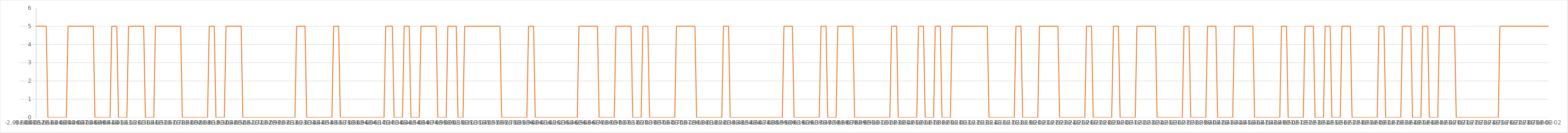
| Category | Series 1 |
|---|---|
| 0.0 | 5 |
| 2e-05 | 5 |
| 4e-05 | 5 |
| 6.000000000000001e-05 | 5 |
| 8e-05 | 5 |
| 0.0001 | 5 |
| 0.00012 | 5 |
| 0.00014000000000000001 | 0 |
| 0.00016 | 0 |
| 0.00018 | 0 |
| 0.0002 | 0 |
| 0.00022 | 0 |
| 0.00024 | 0 |
| 0.00026000000000000003 | 0 |
| 0.00028000000000000003 | 0 |
| 0.00030000000000000003 | 0 |
| 0.00032 | 0 |
| 0.00034 | 0 |
| 0.00036 | 0 |
| 0.00038 | 5 |
| 0.0004 | 5 |
| 0.00042 | 5 |
| 0.00044 | 5 |
| 0.00046 | 5 |
| 0.00048 | 5 |
| 0.0005 | 5 |
| 0.0005200000000000001 | 5 |
| 0.0005400000000000001 | 5 |
| 0.0005600000000000002 | 5 |
| 0.0005800000000000002 | 5 |
| 0.0006000000000000003 | 5 |
| 0.0006200000000000003 | 5 |
| 0.0006400000000000004 | 5 |
| 0.0006600000000000004 | 5 |
| 0.0006800000000000005 | 5 |
| 0.0007000000000000005 | 0 |
| 0.0007200000000000006 | 0 |
| 0.0007400000000000006 | 0 |
| 0.0007600000000000007 | 0 |
| 0.0007800000000000007 | 0 |
| 0.0008000000000000008 | 0 |
| 0.0008200000000000008 | 0 |
| 0.0008400000000000009 | 0 |
| 0.000860000000000001 | 0 |
| 0.000880000000000001 | 0 |
| 0.0009000000000000011 | 5 |
| 0.0009200000000000011 | 5 |
| 0.0009400000000000012 | 5 |
| 0.0009600000000000012 | 5 |
| 0.0009800000000000013 | 0 |
| 0.0010000000000000013 | 0 |
| 0.0010200000000000014 | 0 |
| 0.0010400000000000014 | 0 |
| 0.0010600000000000015 | 0 |
| 0.0010800000000000015 | 0 |
| 0.0011000000000000016 | 5 |
| 0.0011200000000000016 | 5 |
| 0.0011400000000000017 | 5 |
| 0.0011600000000000017 | 5 |
| 0.0011800000000000018 | 5 |
| 0.0012000000000000018 | 5 |
| 0.001220000000000002 | 5 |
| 0.001240000000000002 | 5 |
| 0.001260000000000002 | 5 |
| 0.001280000000000002 | 5 |
| 0.0013000000000000021 | 0 |
| 0.0013200000000000022 | 0 |
| 0.0013400000000000022 | 0 |
| 0.0013600000000000023 | 0 |
| 0.0013800000000000023 | 0 |
| 0.0014000000000000024 | 0 |
| 0.0014200000000000024 | 5 |
| 0.0014400000000000025 | 5 |
| 0.0014600000000000025 | 5 |
| 0.0014800000000000026 | 5 |
| 0.0015000000000000026 | 5 |
| 0.0015200000000000027 | 5 |
| 0.0015400000000000027 | 5 |
| 0.0015600000000000028 | 5 |
| 0.0015800000000000028 | 5 |
| 0.001600000000000003 | 5 |
| 0.001620000000000003 | 5 |
| 0.001640000000000003 | 5 |
| 0.001660000000000003 | 5 |
| 0.001680000000000003 | 5 |
| 0.0017000000000000032 | 5 |
| 0.0017200000000000032 | 5 |
| 0.0017400000000000033 | 0 |
| 0.0017600000000000033 | 0 |
| 0.0017800000000000034 | 0 |
| 0.0018000000000000034 | 0 |
| 0.0018200000000000035 | 0 |
| 0.0018400000000000035 | 0 |
| 0.0018600000000000036 | 0 |
| 0.0018800000000000036 | 0 |
| 0.0019000000000000037 | 0 |
| 0.0019200000000000037 | 0 |
| 0.0019400000000000038 | 0 |
| 0.001960000000000004 | 0 |
| 0.001980000000000004 | 0 |
| 0.002000000000000004 | 0 |
| 0.002020000000000004 | 0 |
| 0.002040000000000004 | 0 |
| 0.002060000000000004 | 5 |
| 0.002080000000000004 | 5 |
| 0.002100000000000004 | 5 |
| 0.0021200000000000043 | 5 |
| 0.0021400000000000043 | 0 |
| 0.0021600000000000044 | 0 |
| 0.0021800000000000044 | 0 |
| 0.0022000000000000045 | 0 |
| 0.0022200000000000045 | 0 |
| 0.0022400000000000046 | 0 |
| 0.0022600000000000046 | 5 |
| 0.0022800000000000047 | 5 |
| 0.0023000000000000047 | 5 |
| 0.002320000000000005 | 5 |
| 0.002340000000000005 | 5 |
| 0.002360000000000005 | 5 |
| 0.002380000000000005 | 5 |
| 0.002400000000000005 | 5 |
| 0.002420000000000005 | 5 |
| 0.002440000000000005 | 5 |
| 0.002460000000000005 | 0 |
| 0.002480000000000005 | 0 |
| 0.0025000000000000053 | 0 |
| 0.0025200000000000053 | 0 |
| 0.0025400000000000054 | 0 |
| 0.0025600000000000054 | 0 |
| 0.0025800000000000055 | 0 |
| 0.0026000000000000055 | 0 |
| 0.0026200000000000056 | 0 |
| 0.0026400000000000056 | 0 |
| 0.0026600000000000057 | 0 |
| 0.0026800000000000057 | 0 |
| 0.0027000000000000058 | 0 |
| 0.002720000000000006 | 0 |
| 0.002740000000000006 | 0 |
| 0.002760000000000006 | 0 |
| 0.002780000000000006 | 0 |
| 0.002800000000000006 | 0 |
| 0.002820000000000006 | 0 |
| 0.002840000000000006 | 0 |
| 0.002860000000000006 | 0 |
| 0.0028800000000000063 | 0 |
| 0.0029000000000000063 | 0 |
| 0.0029200000000000064 | 0 |
| 0.0029400000000000064 | 0 |
| 0.0029600000000000065 | 0 |
| 0.0029800000000000065 | 0 |
| 0.0030000000000000066 | 0 |
| 0.0030200000000000066 | 0 |
| 0.0030400000000000067 | 0 |
| 0.0030600000000000067 | 0 |
| 0.0030800000000000068 | 0 |
| 0.003100000000000007 | 5 |
| 0.003120000000000007 | 5 |
| 0.003140000000000007 | 5 |
| 0.003160000000000007 | 5 |
| 0.003180000000000007 | 5 |
| 0.003200000000000007 | 5 |
| 0.003220000000000007 | 0 |
| 0.003240000000000007 | 0 |
| 0.0032600000000000072 | 0 |
| 0.0032800000000000073 | 0 |
| 0.0033000000000000074 | 0 |
| 0.0033200000000000074 | 0 |
| 0.0033400000000000075 | 0 |
| 0.0033600000000000075 | 0 |
| 0.0033800000000000076 | 0 |
| 0.0034000000000000076 | 0 |
| 0.0034200000000000077 | 0 |
| 0.0034400000000000077 | 0 |
| 0.0034600000000000078 | 0 |
| 0.003480000000000008 | 0 |
| 0.003500000000000008 | 0 |
| 0.003520000000000008 | 0 |
| 0.003540000000000008 | 5 |
| 0.003560000000000008 | 5 |
| 0.003580000000000008 | 5 |
| 0.003600000000000008 | 5 |
| 0.003620000000000008 | 0 |
| 0.0036400000000000082 | 0 |
| 0.0036600000000000083 | 0 |
| 0.0036800000000000084 | 0 |
| 0.0037000000000000084 | 0 |
| 0.0037200000000000085 | 0 |
| 0.0037400000000000085 | 0 |
| 0.0037600000000000086 | 0 |
| 0.0037800000000000086 | 0 |
| 0.0038000000000000087 | 0 |
| 0.0038200000000000087 | 0 |
| 0.0038400000000000088 | 0 |
| 0.003860000000000009 | 0 |
| 0.003880000000000009 | 0 |
| 0.003900000000000009 | 0 |
| 0.0039200000000000085 | 0 |
| 0.003940000000000009 | 0 |
| 0.003960000000000009 | 0 |
| 0.003980000000000009 | 0 |
| 0.004000000000000009 | 0 |
| 0.004020000000000009 | 0 |
| 0.004040000000000009 | 0 |
| 0.004060000000000009 | 0 |
| 0.004080000000000009 | 0 |
| 0.004100000000000009 | 0 |
| 0.004120000000000009 | 0 |
| 0.004140000000000009 | 0 |
| 0.004160000000000009 | 5 |
| 0.004180000000000009 | 5 |
| 0.004200000000000009 | 5 |
| 0.004220000000000009 | 5 |
| 0.004240000000000009 | 5 |
| 0.0042600000000000094 | 0 |
| 0.0042800000000000095 | 0 |
| 0.0043000000000000095 | 0 |
| 0.00432000000000001 | 0 |
| 0.00434000000000001 | 0 |
| 0.00436000000000001 | 0 |
| 0.00438000000000001 | 5 |
| 0.00440000000000001 | 5 |
| 0.00442000000000001 | 5 |
| 0.00444000000000001 | 5 |
| 0.00446000000000001 | 0 |
| 0.00448000000000001 | 0 |
| 0.00450000000000001 | 0 |
| 0.00452000000000001 | 0 |
| 0.00454000000000001 | 0 |
| 0.00456000000000001 | 0 |
| 0.00458000000000001 | 5 |
| 0.00460000000000001 | 5 |
| 0.00462000000000001 | 5 |
| 0.0046400000000000104 | 5 |
| 0.0046600000000000105 | 5 |
| 0.0046800000000000105 | 5 |
| 0.004700000000000011 | 5 |
| 0.004720000000000011 | 5 |
| 0.004740000000000011 | 5 |
| 0.004760000000000011 | 5 |
| 0.004780000000000011 | 0 |
| 0.004800000000000011 | 0 |
| 0.004820000000000011 | 0 |
| 0.004840000000000011 | 0 |
| 0.004860000000000011 | 0 |
| 0.004880000000000011 | 0 |
| 0.004900000000000011 | 5 |
| 0.004920000000000011 | 5 |
| 0.004940000000000011 | 5 |
| 0.004960000000000011 | 5 |
| 0.004980000000000011 | 5 |
| 0.005000000000000011 | 5 |
| 0.005020000000000011 | 0 |
| 0.0050400000000000115 | 0 |
| 0.0050600000000000115 | 0 |
| 0.005080000000000012 | 0 |
| 0.005100000000000012 | 5 |
| 0.005120000000000012 | 5 |
| 0.005140000000000012 | 5 |
| 0.005160000000000012 | 5 |
| 0.005180000000000012 | 5 |
| 0.005200000000000012 | 5 |
| 0.005220000000000012 | 5 |
| 0.005240000000000012 | 5 |
| 0.005260000000000012 | 5 |
| 0.005280000000000012 | 5 |
| 0.005300000000000012 | 5 |
| 0.005320000000000012 | 5 |
| 0.005340000000000012 | 5 |
| 0.005360000000000012 | 5 |
| 0.005380000000000012 | 5 |
| 0.005400000000000012 | 5 |
| 0.0054200000000000125 | 5 |
| 0.0054400000000000125 | 5 |
| 0.005460000000000013 | 5 |
| 0.005480000000000013 | 5 |
| 0.005500000000000013 | 5 |
| 0.005520000000000013 | 5 |
| 0.005540000000000013 | 0 |
| 0.005560000000000013 | 0 |
| 0.005580000000000013 | 0 |
| 0.005600000000000013 | 0 |
| 0.005620000000000013 | 0 |
| 0.005640000000000013 | 0 |
| 0.005660000000000013 | 0 |
| 0.005680000000000013 | 0 |
| 0.005700000000000013 | 0 |
| 0.005720000000000013 | 0 |
| 0.005740000000000013 | 0 |
| 0.005760000000000013 | 0 |
| 0.005780000000000013 | 0 |
| 0.0058000000000000135 | 0 |
| 0.0058200000000000135 | 0 |
| 0.005840000000000014 | 0 |
| 0.005860000000000014 | 5 |
| 0.005880000000000014 | 5 |
| 0.005900000000000014 | 5 |
| 0.005920000000000014 | 5 |
| 0.005940000000000014 | 0 |
| 0.005960000000000014 | 0 |
| 0.005980000000000014 | 0 |
| 0.006000000000000014 | 0 |
| 0.006020000000000014 | 0 |
| 0.006040000000000014 | 0 |
| 0.006060000000000014 | 0 |
| 0.006080000000000014 | 0 |
| 0.006100000000000014 | 0 |
| 0.006120000000000014 | 0 |
| 0.006140000000000014 | 0 |
| 0.006160000000000014 | 0 |
| 0.0061800000000000145 | 0 |
| 0.0062000000000000145 | 0 |
| 0.006220000000000015 | 0 |
| 0.006240000000000015 | 0 |
| 0.006260000000000015 | 0 |
| 0.006280000000000015 | 0 |
| 0.006300000000000015 | 0 |
| 0.006320000000000015 | 0 |
| 0.006340000000000015 | 0 |
| 0.006360000000000015 | 0 |
| 0.006380000000000015 | 0 |
| 0.006400000000000015 | 0 |
| 0.006420000000000015 | 0 |
| 0.006440000000000015 | 0 |
| 0.006460000000000015 | 5 |
| 0.006480000000000015 | 5 |
| 0.006500000000000015 | 5 |
| 0.006520000000000015 | 5 |
| 0.006540000000000015 | 5 |
| 0.0065600000000000155 | 5 |
| 0.0065800000000000155 | 5 |
| 0.006600000000000016 | 5 |
| 0.006620000000000016 | 5 |
| 0.006640000000000016 | 5 |
| 0.006660000000000016 | 5 |
| 0.006680000000000016 | 5 |
| 0.006700000000000016 | 0 |
| 0.006720000000000016 | 0 |
| 0.006740000000000016 | 0 |
| 0.006760000000000016 | 0 |
| 0.006780000000000016 | 0 |
| 0.006800000000000016 | 0 |
| 0.006820000000000016 | 0 |
| 0.006840000000000016 | 0 |
| 0.006860000000000016 | 0 |
| 0.006880000000000016 | 0 |
| 0.006900000000000016 | 5 |
| 0.006920000000000016 | 5 |
| 0.0069400000000000165 | 5 |
| 0.0069600000000000165 | 5 |
| 0.006980000000000017 | 5 |
| 0.007000000000000017 | 5 |
| 0.007020000000000017 | 5 |
| 0.007040000000000017 | 5 |
| 0.007060000000000017 | 5 |
| 0.007080000000000017 | 5 |
| 0.007100000000000017 | 0 |
| 0.007120000000000017 | 0 |
| 0.007140000000000017 | 0 |
| 0.007160000000000017 | 0 |
| 0.007180000000000017 | 0 |
| 0.007200000000000017 | 0 |
| 0.007220000000000017 | 5 |
| 0.007240000000000017 | 5 |
| 0.007260000000000017 | 5 |
| 0.007280000000000017 | 5 |
| 0.007300000000000017 | 0 |
| 0.0073200000000000175 | 0 |
| 0.0073400000000000175 | 0 |
| 0.007360000000000018 | 0 |
| 0.007380000000000018 | 0 |
| 0.007400000000000018 | 0 |
| 0.007420000000000018 | 0 |
| 0.007440000000000018 | 0 |
| 0.007460000000000018 | 0 |
| 0.007480000000000018 | 0 |
| 0.007500000000000018 | 0 |
| 0.007520000000000018 | 0 |
| 0.007540000000000018 | 0 |
| 0.007560000000000018 | 0 |
| 0.007580000000000018 | 0 |
| 0.007600000000000018 | 0 |
| 0.007620000000000018 | 5 |
| 0.007640000000000018 | 5 |
| 0.007660000000000018 | 5 |
| 0.007680000000000018 | 5 |
| 0.0077000000000000185 | 5 |
| 0.0077200000000000185 | 5 |
| 0.007740000000000019 | 5 |
| 0.007760000000000019 | 5 |
| 0.007780000000000019 | 5 |
| 0.007800000000000019 | 5 |
| 0.007820000000000018 | 5 |
| 0.007840000000000017 | 5 |
| 0.007860000000000016 | 0 |
| 0.007880000000000015 | 0 |
| 0.007900000000000015 | 0 |
| 0.007920000000000014 | 0 |
| 0.007940000000000013 | 0 |
| 0.007960000000000012 | 0 |
| 0.007980000000000011 | 0 |
| 0.00800000000000001 | 0 |
| 0.00802000000000001 | 0 |
| 0.008040000000000009 | 0 |
| 0.008060000000000008 | 0 |
| 0.008080000000000007 | 0 |
| 0.008100000000000007 | 0 |
| 0.008120000000000006 | 0 |
| 0.008140000000000005 | 0 |
| 0.008160000000000004 | 0 |
| 0.008180000000000003 | 5 |
| 0.008200000000000002 | 5 |
| 0.008220000000000002 | 5 |
| 0.00824 | 5 |
| 0.00826 | 0 |
| 0.00828 | 0 |
| 0.008299999999999998 | 0 |
| 0.008319999999999998 | 0 |
| 0.008339999999999997 | 0 |
| 0.008359999999999996 | 0 |
| 0.008379999999999995 | 0 |
| 0.008399999999999994 | 0 |
| 0.008419999999999993 | 0 |
| 0.008439999999999993 | 0 |
| 0.008459999999999992 | 0 |
| 0.008479999999999991 | 0 |
| 0.00849999999999999 | 0 |
| 0.00851999999999999 | 0 |
| 0.008539999999999989 | 0 |
| 0.008559999999999988 | 0 |
| 0.008579999999999987 | 0 |
| 0.008599999999999986 | 0 |
| 0.008619999999999985 | 0 |
| 0.008639999999999984 | 0 |
| 0.008659999999999984 | 0 |
| 0.008679999999999983 | 0 |
| 0.008699999999999982 | 0 |
| 0.008719999999999981 | 0 |
| 0.00873999999999998 | 0 |
| 0.00875999999999998 | 0 |
| 0.008779999999999979 | 0 |
| 0.008799999999999978 | 0 |
| 0.008819999999999977 | 0 |
| 0.008839999999999976 | 0 |
| 0.008859999999999976 | 0 |
| 0.008879999999999975 | 0 |
| 0.008899999999999974 | 5 |
| 0.008919999999999973 | 5 |
| 0.008939999999999972 | 5 |
| 0.008959999999999971 | 5 |
| 0.00897999999999997 | 5 |
| 0.00899999999999997 | 5 |
| 0.009019999999999969 | 0 |
| 0.009039999999999968 | 0 |
| 0.009059999999999967 | 0 |
| 0.009079999999999967 | 0 |
| 0.009099999999999966 | 0 |
| 0.009119999999999965 | 0 |
| 0.009139999999999964 | 0 |
| 0.009159999999999963 | 0 |
| 0.009179999999999962 | 0 |
| 0.009199999999999962 | 0 |
| 0.00921999999999996 | 0 |
| 0.00923999999999996 | 0 |
| 0.00925999999999996 | 0 |
| 0.009279999999999958 | 0 |
| 0.009299999999999958 | 0 |
| 0.009319999999999957 | 0 |
| 0.009339999999999956 | 5 |
| 0.009359999999999955 | 5 |
| 0.009379999999999954 | 5 |
| 0.009399999999999954 | 5 |
| 0.009419999999999953 | 0 |
| 0.009439999999999952 | 0 |
| 0.009459999999999951 | 0 |
| 0.00947999999999995 | 0 |
| 0.00949999999999995 | 0 |
| 0.009519999999999949 | 0 |
| 0.009539999999999948 | 5 |
| 0.009559999999999947 | 5 |
| 0.009579999999999946 | 5 |
| 0.009599999999999945 | 5 |
| 0.009619999999999945 | 5 |
| 0.009639999999999944 | 5 |
| 0.009659999999999943 | 5 |
| 0.009679999999999942 | 5 |
| 0.009699999999999941 | 5 |
| 0.00971999999999994 | 5 |
| 0.00973999999999994 | 0 |
| 0.009759999999999939 | 0 |
| 0.009779999999999938 | 0 |
| 0.009799999999999937 | 0 |
| 0.009819999999999936 | 0 |
| 0.009839999999999936 | 0 |
| 0.009859999999999935 | 0 |
| 0.009879999999999934 | 0 |
| 0.009899999999999933 | 0 |
| 0.009919999999999932 | 0 |
| 0.009939999999999932 | 0 |
| 0.00995999999999993 | 0 |
| 0.00997999999999993 | 0 |
| 0.009999999999999929 | 0 |
| 0.010019999999999928 | 0 |
| 0.010039999999999927 | 0 |
| 0.010059999999999927 | 0 |
| 0.010079999999999926 | 0 |
| 0.010099999999999925 | 0 |
| 0.010119999999999924 | 0 |
| 0.010139999999999923 | 0 |
| 0.010159999999999923 | 0 |
| 0.010179999999999922 | 5 |
| 0.010199999999999921 | 5 |
| 0.01021999999999992 | 5 |
| 0.01023999999999992 | 5 |
| 0.010259999999999918 | 0 |
| 0.010279999999999918 | 0 |
| 0.010299999999999917 | 0 |
| 0.010319999999999916 | 0 |
| 0.010339999999999915 | 0 |
| 0.010359999999999914 | 0 |
| 0.010379999999999914 | 0 |
| 0.010399999999999913 | 0 |
| 0.010419999999999912 | 0 |
| 0.010439999999999911 | 0 |
| 0.01045999999999991 | 0 |
| 0.01047999999999991 | 0 |
| 0.010499999999999909 | 5 |
| 0.010519999999999908 | 5 |
| 0.010539999999999907 | 5 |
| 0.010559999999999906 | 5 |
| 0.010579999999999905 | 0 |
| 0.010599999999999905 | 0 |
| 0.010619999999999904 | 0 |
| 0.010639999999999903 | 0 |
| 0.010659999999999902 | 0 |
| 0.010679999999999901 | 0 |
| 0.0106999999999999 | 5 |
| 0.0107199999999999 | 5 |
| 0.010739999999999899 | 5 |
| 0.010759999999999898 | 5 |
| 0.010779999999999897 | 0 |
| 0.010799999999999896 | 0 |
| 0.010819999999999896 | 0 |
| 0.010839999999999895 | 0 |
| 0.010859999999999894 | 0 |
| 0.010879999999999893 | 0 |
| 0.010899999999999892 | 5 |
| 0.010919999999999892 | 5 |
| 0.01093999999999989 | 5 |
| 0.01095999999999989 | 5 |
| 0.01097999999999989 | 5 |
| 0.010999999999999888 | 5 |
| 0.011019999999999888 | 5 |
| 0.011039999999999887 | 5 |
| 0.011059999999999886 | 5 |
| 0.011079999999999885 | 5 |
| 0.011099999999999884 | 5 |
| 0.011119999999999883 | 5 |
| 0.011139999999999883 | 5 |
| 0.011159999999999882 | 5 |
| 0.011179999999999881 | 5 |
| 0.01119999999999988 | 5 |
| 0.01121999999999988 | 5 |
| 0.011239999999999879 | 5 |
| 0.011259999999999878 | 5 |
| 0.011279999999999877 | 5 |
| 0.011299999999999876 | 5 |
| 0.011319999999999875 | 5 |
| 0.011339999999999874 | 0 |
| 0.011359999999999874 | 0 |
| 0.011379999999999873 | 0 |
| 0.011399999999999872 | 0 |
| 0.011419999999999871 | 0 |
| 0.01143999999999987 | 0 |
| 0.01145999999999987 | 0 |
| 0.011479999999999869 | 0 |
| 0.011499999999999868 | 0 |
| 0.011519999999999867 | 0 |
| 0.011539999999999866 | 0 |
| 0.011559999999999866 | 0 |
| 0.011579999999999865 | 0 |
| 0.011599999999999864 | 0 |
| 0.011619999999999863 | 0 |
| 0.011639999999999862 | 0 |
| 0.011659999999999861 | 5 |
| 0.01167999999999986 | 5 |
| 0.01169999999999986 | 5 |
| 0.011719999999999859 | 5 |
| 0.011739999999999858 | 0 |
| 0.011759999999999857 | 0 |
| 0.011779999999999857 | 0 |
| 0.011799999999999856 | 0 |
| 0.011819999999999855 | 0 |
| 0.011839999999999854 | 0 |
| 0.011859999999999853 | 0 |
| 0.011879999999999852 | 0 |
| 0.011899999999999852 | 0 |
| 0.01191999999999985 | 0 |
| 0.01193999999999985 | 5 |
| 0.01195999999999985 | 5 |
| 0.011979999999999848 | 5 |
| 0.011999999999999848 | 5 |
| 0.012019999999999847 | 5 |
| 0.012039999999999846 | 5 |
| 0.012059999999999845 | 5 |
| 0.012079999999999844 | 5 |
| 0.012099999999999844 | 5 |
| 0.012119999999999843 | 5 |
| 0.012139999999999842 | 5 |
| 0.012159999999999841 | 5 |
| 0.01217999999999984 | 0 |
| 0.01219999999999984 | 0 |
| 0.012219999999999839 | 0 |
| 0.012239999999999838 | 0 |
| 0.012259999999999837 | 0 |
| 0.012279999999999836 | 0 |
| 0.012299999999999835 | 0 |
| 0.012319999999999835 | 0 |
| 0.012339999999999834 | 0 |
| 0.012359999999999833 | 0 |
| 0.012379999999999832 | 0 |
| 0.012399999999999831 | 0 |
| 0.01241999999999983 | 0 |
| 0.01243999999999983 | 0 |
| 0.012459999999999829 | 0 |
| 0.012479999999999828 | 0 |
| 0.012499999999999827 | 5 |
| 0.012519999999999826 | 5 |
| 0.012539999999999826 | 5 |
| 0.012559999999999825 | 5 |
| 0.012579999999999824 | 0 |
| 0.012599999999999823 | 0 |
| 0.012619999999999822 | 0 |
| 0.012639999999999822 | 0 |
| 0.01265999999999982 | 0 |
| 0.01267999999999982 | 0 |
| 0.012699999999999819 | 0 |
| 0.012719999999999818 | 0 |
| 0.012739999999999817 | 0 |
| 0.012759999999999817 | 0 |
| 0.012779999999999816 | 0 |
| 0.012799999999999815 | 0 |
| 0.012819999999999814 | 5 |
| 0.012839999999999813 | 5 |
| 0.012859999999999813 | 5 |
| 0.012879999999999812 | 5 |
| 0.012899999999999811 | 0 |
| 0.01291999999999981 | 0 |
| 0.01293999999999981 | 0 |
| 0.012959999999999808 | 0 |
| 0.012979999999999808 | 0 |
| 0.012999999999999807 | 0 |
| 0.013019999999999806 | 0 |
| 0.013039999999999805 | 0 |
| 0.013059999999999804 | 0 |
| 0.013079999999999804 | 0 |
| 0.013099999999999803 | 5 |
| 0.013119999999999802 | 5 |
| 0.013139999999999801 | 5 |
| 0.0131599999999998 | 5 |
| 0.0131799999999998 | 5 |
| 0.013199999999999799 | 5 |
| 0.013219999999999798 | 5 |
| 0.013239999999999797 | 5 |
| 0.013259999999999796 | 5 |
| 0.013279999999999795 | 5 |
| 0.013299999999999795 | 5 |
| 0.013319999999999794 | 5 |
| 0.013339999999999793 | 0 |
| 0.013359999999999792 | 0 |
| 0.013379999999999791 | 0 |
| 0.01339999999999979 | 0 |
| 0.01341999999999979 | 0 |
| 0.013439999999999789 | 0 |
| 0.013459999999999788 | 0 |
| 0.013479999999999787 | 0 |
| 0.013499999999999786 | 0 |
| 0.013519999999999786 | 0 |
| 0.013539999999999785 | 0 |
| 0.013559999999999784 | 0 |
| 0.013579999999999783 | 0 |
| 0.013599999999999782 | 0 |
| 0.013619999999999782 | 0 |
| 0.01363999999999978 | 0 |
| 0.01365999999999978 | 5 |
| 0.01367999999999978 | 5 |
| 0.013699999999999778 | 5 |
| 0.013719999999999778 | 5 |
| 0.013739999999999777 | 0 |
| 0.013759999999999776 | 0 |
| 0.013779999999999775 | 0 |
| 0.013799999999999774 | 0 |
| 0.013819999999999773 | 0 |
| 0.013839999999999773 | 0 |
| 0.013859999999999772 | 0 |
| 0.013879999999999771 | 0 |
| 0.01389999999999977 | 0 |
| 0.01391999999999977 | 0 |
| 0.013939999999999769 | 5 |
| 0.013959999999999768 | 5 |
| 0.013979999999999767 | 5 |
| 0.013999999999999766 | 5 |
| 0.014019999999999765 | 5 |
| 0.014039999999999764 | 5 |
| 0.014059999999999764 | 0 |
| 0.014079999999999763 | 0 |
| 0.014099999999999762 | 0 |
| 0.014119999999999761 | 0 |
| 0.01413999999999976 | 0 |
| 0.01415999999999976 | 0 |
| 0.014179999999999759 | 0 |
| 0.014199999999999758 | 0 |
| 0.014219999999999757 | 0 |
| 0.014239999999999756 | 0 |
| 0.014259999999999756 | 5 |
| 0.014279999999999755 | 5 |
| 0.014299999999999754 | 5 |
| 0.014319999999999753 | 5 |
| 0.014339999999999752 | 5 |
| 0.014359999999999751 | 5 |
| 0.01437999999999975 | 5 |
| 0.01439999999999975 | 5 |
| 0.014419999999999749 | 5 |
| 0.014439999999999748 | 5 |
| 0.014459999999999747 | 5 |
| 0.014479999999999747 | 5 |
| 0.014499999999999746 | 0 |
| 0.014519999999999745 | 0 |
| 0.014539999999999744 | 0 |
| 0.014559999999999743 | 0 |
| 0.014579999999999742 | 0 |
| 0.014599999999999742 | 0 |
| 0.01461999999999974 | 0 |
| 0.01463999999999974 | 0 |
| 0.01465999999999974 | 0 |
| 0.014679999999999738 | 0 |
| 0.014699999999999738 | 0 |
| 0.014719999999999737 | 0 |
| 0.014739999999999736 | 0 |
| 0.014759999999999735 | 0 |
| 0.014779999999999734 | 0 |
| 0.014799999999999734 | 0 |
| 0.014819999999999733 | 5 |
| 0.014839999999999732 | 5 |
| 0.014859999999999731 | 5 |
| 0.01487999999999973 | 5 |
| 0.01489999999999973 | 0 |
| 0.014919999999999729 | 0 |
| 0.014939999999999728 | 0 |
| 0.014959999999999727 | 0 |
| 0.014979999999999726 | 0 |
| 0.014999999999999725 | 0 |
| 0.015019999999999725 | 0 |
| 0.015039999999999724 | 0 |
| 0.015059999999999723 | 0 |
| 0.015079999999999722 | 0 |
| 0.015099999999999721 | 5 |
| 0.01511999999999972 | 5 |
| 0.01513999999999972 | 5 |
| 0.015159999999999719 | 5 |
| 0.015179999999999718 | 5 |
| 0.015199999999999717 | 5 |
| 0.015219999999999716 | 0 |
| 0.015239999999999716 | 0 |
| 0.015259999999999715 | 0 |
| 0.015279999999999714 | 0 |
| 0.015299999999999713 | 0 |
| 0.015319999999999712 | 0 |
| 0.015339999999999712 | 5 |
| 0.01535999999999971 | 5 |
| 0.01537999999999971 | 5 |
| 0.015399999999999709 | 5 |
| 0.015419999999999708 | 0 |
| 0.015439999999999707 | 0 |
| 0.015459999999999707 | 0 |
| 0.015479999999999706 | 0 |
| 0.015499999999999705 | 0 |
| 0.015519999999999704 | 0 |
| 0.015539999999999703 | 5 |
| 0.015559999999999703 | 5 |
| 0.015579999999999702 | 5 |
| 0.015599999999999701 | 5 |
| 0.0156199999999997 | 5 |
| 0.0156399999999997 | 5 |
| 0.0156599999999997 | 0 |
| 0.015679999999999698 | 0 |
| 0.015699999999999697 | 0 |
| 0.015719999999999696 | 0 |
| 0.015739999999999695 | 0 |
| 0.015759999999999694 | 0 |
| 0.015779999999999694 | 0 |
| 0.015799999999999693 | 0 |
| 0.015819999999999692 | 0 |
| 0.01583999999999969 | 0 |
| 0.01585999999999969 | 0 |
| 0.01587999999999969 | 0 |
| 0.01589999999999969 | 0 |
| 0.015919999999999688 | 0 |
| 0.015939999999999687 | 0 |
| 0.015959999999999686 | 0 |
| 0.015979999999999685 | 5 |
| 0.015999999999999685 | 5 |
| 0.016019999999999684 | 5 |
| 0.016039999999999683 | 5 |
| 0.016059999999999682 | 0 |
| 0.01607999999999968 | 0 |
| 0.01609999999999968 | 0 |
| 0.01611999999999968 | 0 |
| 0.01613999999999968 | 0 |
| 0.016159999999999678 | 0 |
| 0.016179999999999677 | 0 |
| 0.016199999999999676 | 0 |
| 0.016219999999999676 | 0 |
| 0.016239999999999675 | 0 |
| 0.016259999999999674 | 5 |
| 0.016279999999999673 | 5 |
| 0.016299999999999672 | 5 |
| 0.01631999999999967 | 5 |
| 0.01633999999999967 | 5 |
| 0.01635999999999967 | 5 |
| 0.01637999999999967 | 0 |
| 0.01639999999999967 | 0 |
| 0.016419999999999668 | 0 |
| 0.016439999999999667 | 0 |
| 0.016459999999999666 | 0 |
| 0.016479999999999665 | 0 |
| 0.016499999999999664 | 5 |
| 0.016519999999999663 | 5 |
| 0.016539999999999663 | 5 |
| 0.016559999999999662 | 5 |
| 0.01657999999999966 | 0 |
| 0.01659999999999966 | 0 |
| 0.01661999999999966 | 0 |
| 0.01663999999999966 | 0 |
| 0.016659999999999658 | 0 |
| 0.016679999999999657 | 0 |
| 0.016699999999999656 | 5 |
| 0.016719999999999655 | 5 |
| 0.016739999999999654 | 5 |
| 0.016759999999999654 | 5 |
| 0.016779999999999653 | 5 |
| 0.016799999999999652 | 5 |
| 0.01681999999999965 | 5 |
| 0.01683999999999965 | 5 |
| 0.01685999999999965 | 5 |
| 0.01687999999999965 | 5 |
| 0.016899999999999648 | 0 |
| 0.016919999999999647 | 0 |
| 0.016939999999999646 | 0 |
| 0.016959999999999645 | 0 |
| 0.016979999999999645 | 0 |
| 0.016999999999999644 | 0 |
| 0.017019999999999643 | 0 |
| 0.017039999999999642 | 0 |
| 0.01705999999999964 | 0 |
| 0.01707999999999964 | 0 |
| 0.01709999999999964 | 0 |
| 0.01711999999999964 | 0 |
| 0.017139999999999638 | 0 |
| 0.017159999999999637 | 0 |
| 0.017179999999999637 | 0 |
| 0.017199999999999636 | 0 |
| 0.017219999999999635 | 0 |
| 0.017239999999999634 | 0 |
| 0.017259999999999633 | 0 |
| 0.017279999999999632 | 0 |
| 0.01729999999999963 | 0 |
| 0.01731999999999963 | 0 |
| 0.01733999999999963 | 0 |
| 0.01735999999999963 | 0 |
| 0.01737999999999963 | 0 |
| 0.017399999999999628 | 0 |
| 0.017419999999999627 | 5 |
| 0.017439999999999626 | 5 |
| 0.017459999999999625 | 5 |
| 0.017479999999999624 | 5 |
| 0.017499999999999623 | 5 |
| 0.017519999999999623 | 5 |
| 0.017539999999999622 | 5 |
| 0.01755999999999962 | 5 |
| 0.01757999999999962 | 5 |
| 0.01759999999999962 | 5 |
| 0.01761999999999962 | 5 |
| 0.017639999999999618 | 5 |
| 0.017659999999999617 | 5 |
| 0.017679999999999616 | 5 |
| 0.017699999999999615 | 5 |
| 0.017719999999999615 | 5 |
| 0.017739999999999614 | 5 |
| 0.017759999999999613 | 5 |
| 0.017779999999999612 | 5 |
| 0.01779999999999961 | 5 |
| 0.01781999999999961 | 5 |
| 0.01783999999999961 | 5 |
| 0.01785999999999961 | 5 |
| 0.017879999999999608 | 5 |
| 0.017899999999999607 | 5 |
| 0.017919999999999606 | 5 |
| 0.017939999999999606 | 5 |
| 0.017959999999999605 | 5 |
| 0.017979999999999604 | 5 |
| 0.017999999999999603 | 5 |
| 0.018019999999999602 | 5 |
| 0.0180399999999996 | 5 |
| 0.0180599999999996 | 5 |
| 0.0180799999999996 | 5 |
| 0.0180999999999996 | 5 |
| 0.018119999999999598 | 5 |
| 0.018139999999999597 | 5 |
| 0.018159999999999597 | 5 |
| 0.018179999999999596 | 5 |
| 0.018199999999999595 | 5 |
| 0.018219999999999594 | 5 |
| 0.018239999999999593 | 5 |
| 0.018259999999999593 | 5 |
| 0.01827999999999959 | 5 |
| 0.01829999999999959 | 5 |
| 0.01831999999999959 | 5 |
| 0.01833999999999959 | 5 |
| 0.01835999999999959 | 5 |
| 0.018379999999999588 | 5 |
| 0.018399999999999587 | 5 |
| 0.018419999999999586 | 5 |
| 0.018439999999999585 | 5 |
| 0.018459999999999584 | 5 |
| 0.018479999999999584 | 5 |
| 0.018499999999999583 | 5 |
| 0.018519999999999582 | 5 |
| 0.01853999999999958 | 5 |
| 0.01855999999999958 | 5 |
| 0.01857999999999958 | 5 |
| 0.01859999999999958 | 5 |
| 0.018619999999999578 | 5 |
| 0.018639999999999577 | 5 |
| 0.018659999999999576 | 5 |
| 0.018679999999999575 | 5 |
| 0.018699999999999575 | 5 |
| 0.018719999999999574 | 5 |
| 0.018739999999999573 | 5 |
| 0.018759999999999572 | 5 |
| 0.01877999999999957 | 5 |
| 0.01879999999999957 | 5 |
| 0.01881999999999957 | 5 |
| 0.01883999999999957 | 5 |
| 0.018859999999999568 | 5 |
| 0.018879999999999567 | 5 |
| 0.018899999999999566 | 5 |
| 0.018919999999999566 | 5 |
| 0.018939999999999565 | 5 |
| 0.018959999999999564 | 5 |
| 0.018979999999999563 | 5 |
| 0.018999999999999562 | 5 |
| 0.01901999999999956 | 5 |
| 0.01903999999999956 | 5 |
| 0.01905999999999956 | 5 |
| 0.01907999999999956 | 5 |
| 0.01909999999999956 | 5 |
| 0.019119999999999557 | 5 |
| 0.019139999999999557 | 5 |
| 0.019159999999999556 | 5 |
| 0.019179999999999555 | 5 |
| 0.019199999999999554 | 5 |
| 0.019219999999999553 | 5 |
| 0.019239999999999553 | 5 |
| 0.019259999999999552 | 5 |
| 0.01927999999999955 | 5 |
| 0.01929999999999955 | 5 |
| 0.01931999999999955 | 5 |
| 0.01933999999999955 | 5 |
| 0.019359999999999548 | 5 |
| 0.019379999999999547 | 5 |
| 0.019399999999999546 | 5 |
| 0.019419999999999545 | 5 |
| 0.019439999999999544 | 5 |
| 0.019459999999999544 | 5 |
| 0.019479999999999543 | 5 |
| 0.019499999999999542 | 5 |
| 0.01951999999999954 | 5 |
| 0.01953999999999954 | 5 |
| 0.01955999999999954 | 5 |
| 0.01957999999999954 | 5 |
| 0.019599999999999538 | 5 |
| 0.019619999999999537 | 5 |
| 0.019639999999999536 | 5 |
| 0.019659999999999535 | 5 |
| 0.019679999999999535 | 5 |
| 0.019699999999999534 | 5 |
| 0.019719999999999533 | 5 |
| 0.019739999999999532 | 5 |
| 0.01975999999999953 | 5 |
| 0.01977999999999953 | 5 |
| 0.01979999999999953 | 5 |
| 0.01981999999999953 | 5 |
| 0.019839999999999528 | 5 |
| 0.019859999999999527 | 5 |
| 0.019879999999999527 | 5 |
| 0.019899999999999526 | 5 |
| 0.019919999999999525 | 5 |
| 0.019939999999999524 | 5 |
| 0.019959999999999523 | 5 |
| 0.019979999999999522 | 5 |
| 0.01999999999999952 | 5 |
| 0.02001999999999952 | 5 |
| 0.02003999999999952 | 5 |
| 0.02005999999999952 | 5 |
| 0.02007999999999952 | 5 |
| 0.020099999999999518 | 5 |
| 0.020119999999999517 | 5 |
| 0.020139999999999516 | 5 |
| 0.020159999999999515 | 5 |
| 0.020179999999999514 | 5 |
| 0.020199999999999513 | 5 |
| 0.020219999999999513 | 5 |
| 0.020239999999999512 | 5 |
| 0.02025999999999951 | 5 |
| 0.02027999999999951 | 5 |
| 0.02029999999999951 | 5 |
| 0.02031999999999951 | 5 |
| 0.020339999999999508 | 5 |
| 0.020359999999999507 | 5 |
| 0.020379999999999506 | 5 |
| 0.020399999999999505 | 5 |
| 0.020419999999999505 | 5 |
| 0.020439999999999504 | 5 |
| 0.020459999999999503 | 5 |
| 0.020479999999999502 | 5 |
| 0.0204999999999995 | 5 |
| 0.0205199999999995 | 5 |
| 0.0205399999999995 | 5 |
| 0.0205599999999995 | 5 |
| 0.020579999999999498 | 5 |
| 0.020599999999999497 | 5 |
| 0.020619999999999496 | 5 |
| 0.020639999999999496 | 5 |
| 0.020659999999999495 | 5 |
| 0.020679999999999494 | 5 |
| 0.020699999999999493 | 5 |
| 0.020719999999999492 | 5 |
| 0.02073999999999949 | 5 |
| 0.02075999999999949 | 5 |
| 0.02077999999999949 | 5 |
| 0.02079999999999949 | 5 |
| 0.020819999999999488 | 5 |
| 0.020839999999999487 | 5 |
| 0.020859999999999487 | 5 |
| 0.020879999999999486 | 5 |
| 0.020899999999999485 | 5 |
| 0.020919999999999484 | 5 |
| 0.020939999999999483 | 5 |
| 0.020959999999999483 | 5 |
| 0.02097999999999948 | 5 |
| 0.02099999999999948 | 5 |
| 0.02101999999999948 | 5 |
| 0.02103999999999948 | 5 |
| 0.02105999999999948 | 5 |
| 0.021079999999999478 | 5 |
| 0.021099999999999477 | 5 |
| 0.021119999999999476 | 5 |
| 0.021139999999999475 | 5 |
| 0.021159999999999474 | 5 |
| 0.021179999999999474 | 5 |
| 0.021199999999999473 | 5 |
| 0.021219999999999472 | 5 |
| 0.02123999999999947 | 5 |
| 0.02125999999999947 | 5 |
| 0.02127999999999947 | 5 |
| 0.02129999999999947 | 5 |
| 0.021319999999999468 | 5 |
| 0.021339999999999467 | 5 |
| 0.021359999999999466 | 5 |
| 0.021379999999999465 | 5 |
| 0.021399999999999465 | 5 |
| 0.021419999999999464 | 5 |
| 0.021439999999999463 | 5 |
| 0.021459999999999462 | 5 |
| 0.02147999999999946 | 5 |
| 0.02149999999999946 | 5 |
| 0.02151999999999946 | 5 |
| 0.02153999999999946 | 5 |
| 0.021559999999999458 | 5 |
| 0.021579999999999457 | 5 |
| 0.021599999999999456 | 5 |
| 0.021619999999999456 | 5 |
| 0.021639999999999455 | 5 |
| 0.021659999999999454 | 5 |
| 0.021679999999999453 | 5 |
| 0.021699999999999452 | 5 |
| 0.02171999999999945 | 5 |
| 0.02173999999999945 | 5 |
| 0.02175999999999945 | 5 |
| 0.02177999999999945 | 5 |
| 0.02179999999999945 | 5 |
| 0.021819999999999447 | 5 |
| 0.021839999999999447 | 5 |
| 0.021859999999999446 | 5 |
| 0.021879999999999445 | 5 |
| 0.021899999999999444 | 5 |
| 0.021919999999999443 | 5 |
| 0.021939999999999443 | 5 |
| 0.021959999999999442 | 5 |
| 0.02197999999999944 | 5 |
| 0.02199999999999944 | 5 |
| 0.02201999999999944 | 5 |
| 0.02203999999999944 | 5 |
| 0.022059999999999438 | 5 |
| 0.022079999999999437 | 5 |
| 0.022099999999999436 | 5 |
| 0.022119999999999435 | 5 |
| 0.022139999999999434 | 5 |